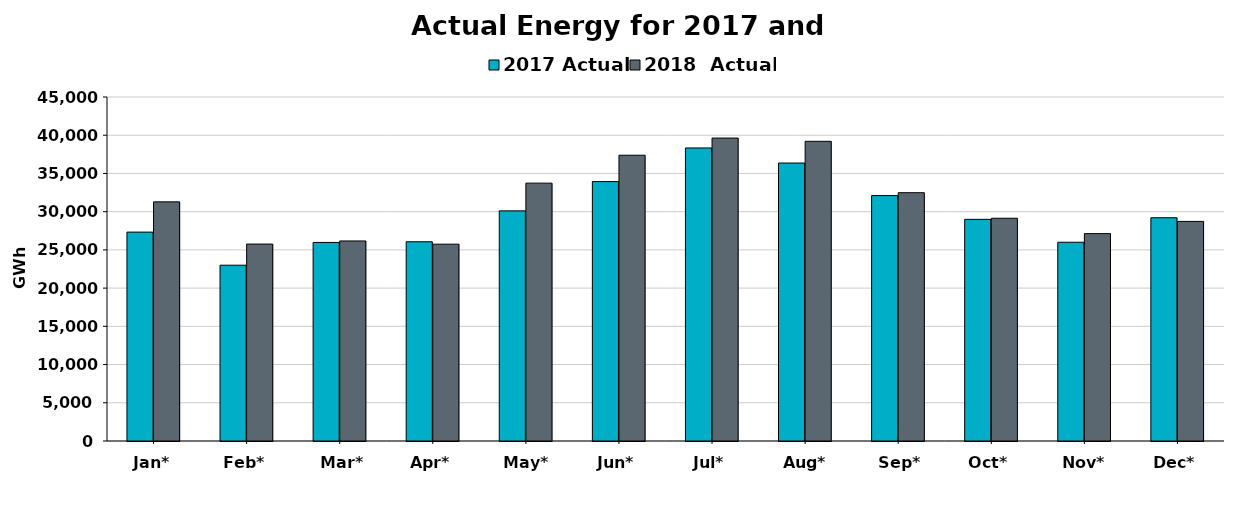
| Category | 2017 Actual | 2018  Actual |
|---|---|---|
| Jan* | 27327 | 31282 |
| Feb* | 22998 | 25761 |
| Mar* | 25974 | 26170 |
| Apr* | 26063 | 25749 |
| May* | 30104 | 33733 |
| Jun* | 33938 | 37384 |
| Jul* | 38336 | 39629 |
| Aug* | 36361 | 39205 |
| Sep* | 32106 | 32481 |
| Oct* | 28995 | 29136 |
| Nov* | 25999 | 27128 |
| Dec* | 29208 | 28725 |